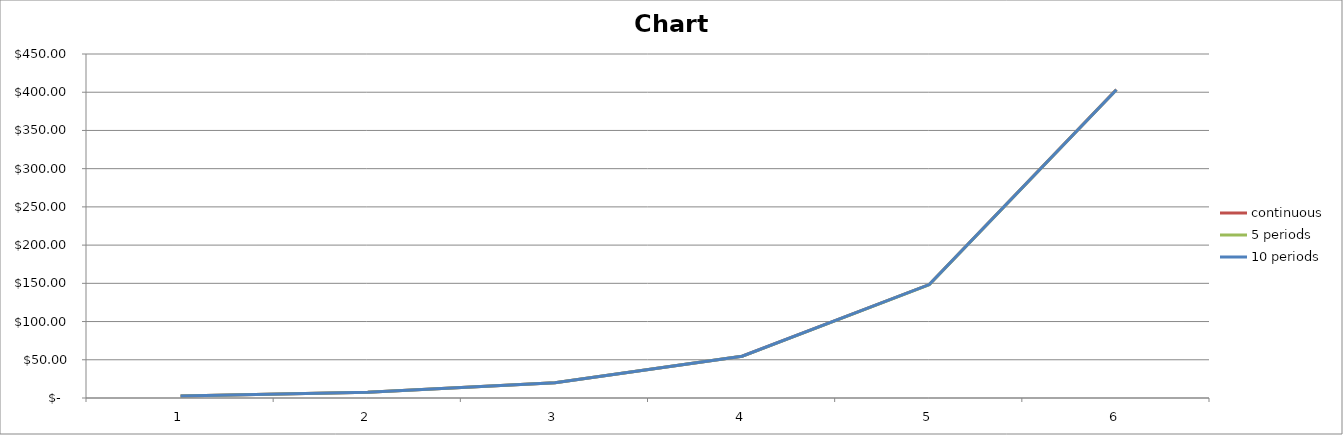
| Category | continuous | 5 periods | 10 periods |
|---|---|---|---|
| 1.0 | 2.718 | 2.718 | 2.718 |
| 2.0 | 7.389 | 7.388 | 7.388 |
| 3.0 | 20.086 | 20.08 | 20.083 |
| 4.0 | 54.598 | 54.576 | 54.587 |
| 5.0 | 148.413 | 148.339 | 148.376 |
| 6.0 | 403.429 | 403.187 | 403.308 |